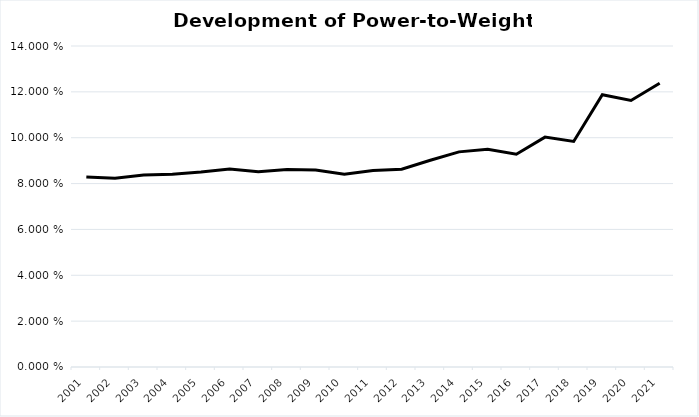
| Category | Series 0 |
|---|---|
| 2001.0 | 0.083 |
| 2002.0 | 0.082 |
| 2003.0 | 0.084 |
| 2004.0 | 0.084 |
| 2005.0 | 0.085 |
| 2006.0 | 0.086 |
| 2007.0 | 0.085 |
| 2008.0 | 0.086 |
| 2009.0 | 0.086 |
| 2010.0 | 0.084 |
| 2011.0 | 0.086 |
| 2012.0 | 0.086 |
| 2013.0 | 0.09 |
| 2014.0 | 0.094 |
| 2015.0 | 0.095 |
| 2016.0 | 0.093 |
| 2017.0 | 0.1 |
| 2018.0 | 0.098 |
| 2019.0 | 0.119 |
| 2020.0 | 0.116 |
| 2021.0 | 0.124 |